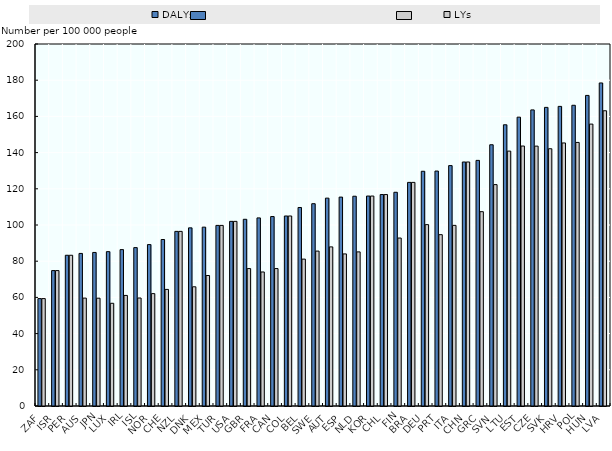
| Category | DALYs | LYs |
|---|---|---|
| ZAF | 59.338 | 59.338 |
| ISR | 74.81 | 74.81 |
| PER | 83.285 | 83.285 |
| AUS | 84.294 | 59.609 |
| JPN | 84.833 | 59.563 |
| LUX | 85.274 | 56.75 |
| IRL | 86.4 | 61.09 |
| ISL | 87.505 | 59.661 |
| NOR | 89.177 | 62.089 |
| CHE | 91.989 | 64.409 |
| NZL | 96.477 | 96.477 |
| DNK | 98.417 | 65.864 |
| MEX | 98.811 | 72.092 |
| TUR | 99.78 | 99.78 |
| USA | 102.006 | 102.006 |
| GBR | 103.157 | 75.925 |
| FRA | 103.921 | 74.048 |
| CAN | 104.679 | 75.933 |
| COL | 104.98 | 104.98 |
| BEL | 109.67 | 81.15 |
| SWE | 111.773 | 85.589 |
| AUT | 114.839 | 87.913 |
| ESP | 115.41 | 84.025 |
| NLD | 115.896 | 85.152 |
| KOR | 116.001 | 116.001 |
| CHL | 116.817 | 116.817 |
| FIN | 118.084 | 92.793 |
| BRA | 123.549 | 123.549 |
| DEU | 129.685 | 100.204 |
| PRT | 129.802 | 94.663 |
| ITA | 132.82 | 99.801 |
| CHN | 134.807 | 134.807 |
| GRC | 135.701 | 107.361 |
| SVN | 144.334 | 122.315 |
| LTU | 155.368 | 140.83 |
| EST | 159.579 | 143.622 |
| CZE | 163.592 | 143.57 |
| SVK | 164.978 | 142.13 |
| HRV | 165.534 | 145.328 |
| POL | 166.146 | 145.622 |
| HUN | 171.598 | 155.746 |
| LVA | 178.473 | 163.116 |